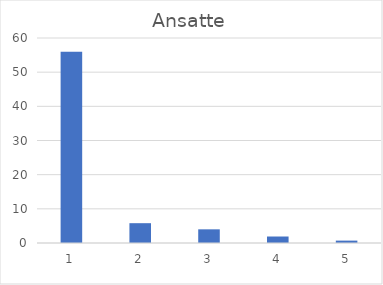
| Category | Series 0 |
|---|---|
| 0 | 56 |
| 1 | 5.8 |
| 2 | 4 |
| 3 | 1.9 |
| 4 | 0.7 |